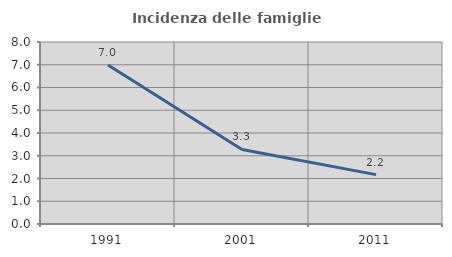
| Category | Incidenza delle famiglie numerose |
|---|---|
| 1991.0 | 6.989 |
| 2001.0 | 3.279 |
| 2011.0 | 2.171 |